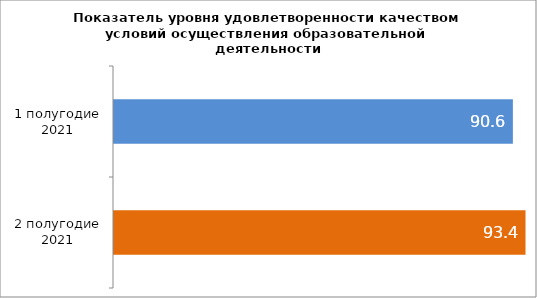
| Category | Series 0 |
|---|---|
| 1 полугодие 2021 | 90.567 |
| 2 полугодие 2021 | 93.437 |